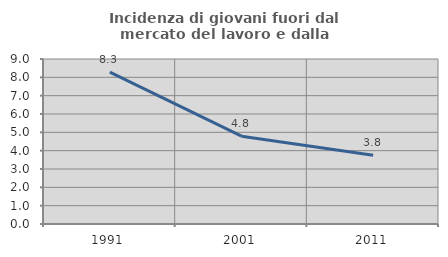
| Category | Incidenza di giovani fuori dal mercato del lavoro e dalla formazione  |
|---|---|
| 1991.0 | 8.281 |
| 2001.0 | 4.79 |
| 2011.0 | 3.75 |